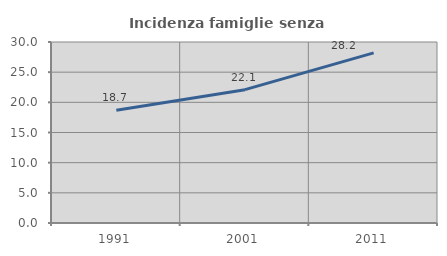
| Category | Incidenza famiglie senza nuclei |
|---|---|
| 1991.0 | 18.673 |
| 2001.0 | 22.102 |
| 2011.0 | 28.206 |